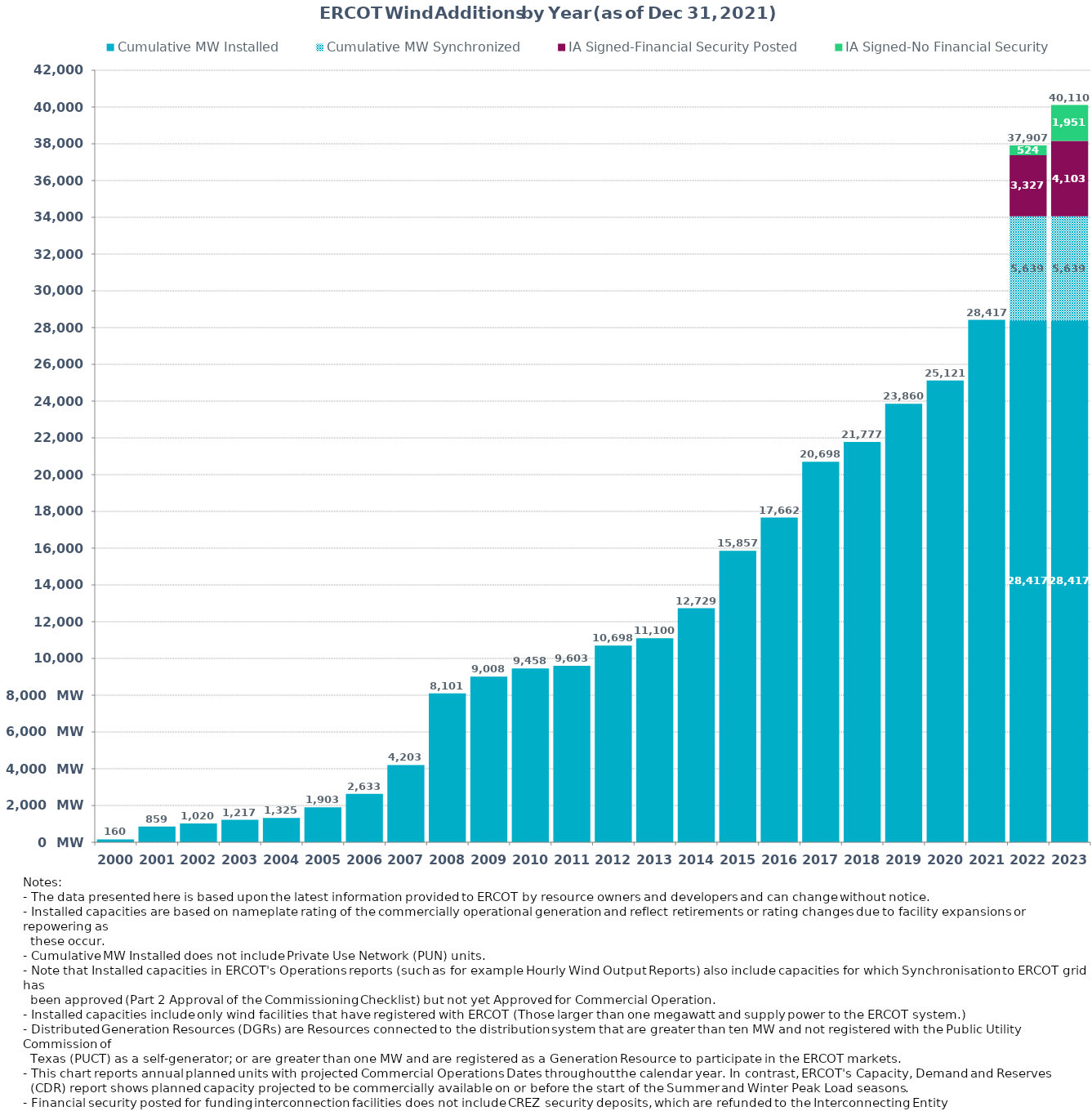
| Category | Cumulative MW Installed | Cumulative MW Synchronized | IA Signed-Financial Security Posted  | IA Signed-No Financial Security  | Other Planned | Cumulative Installed and Planned |
|---|---|---|---|---|---|---|
| 2000.0 | 160.37 | 0 | 0 | 0 | 0 | 160.37 |
| 2001.0 | 859.29 | 0 | 0 | 0 | 0 | 859.29 |
| 2002.0 | 1019.79 | 0 | 0 | 0 | 0 | 1019.79 |
| 2003.0 | 1217.29 | 0 | 0 | 0 | 0 | 1217.29 |
| 2004.0 | 1325.29 | 0 | 0 | 0 | 0 | 1325.29 |
| 2005.0 | 1902.69 | 0 | 0 | 0 | 0 | 1902.69 |
| 2006.0 | 2633.39 | 0 | 0 | 0 | 0 | 2633.39 |
| 2007.0 | 4203.41 | 0 | 0 | 0 | 0 | 4203.41 |
| 2008.0 | 8101.01 | 0 | 0 | 0 | 0 | 8101.01 |
| 2009.0 | 9007.57 | 0 | 0 | 0 | 0 | 9007.57 |
| 2010.0 | 9458.49 | 0 | 0 | 0 | 0 | 9458.49 |
| 2011.0 | 9603.49 | 0 | 0 | 0 | 0 | 9603.49 |
| 2012.0 | 10698.35 | 0 | 0 | 0 | 0 | 10698.35 |
| 2013.0 | 11100.05 | 0 | 0 | 0 | 0 | 11100.05 |
| 2014.0 | 12728.93 | 0 | 0 | 0 | 0 | 12728.93 |
| 2015.0 | 15857.48 | 0 | 0 | 0 | 0 | 15857.48 |
| 2016.0 | 17662.45 | 0 | 0 | 0 | 0 | 17662.45 |
| 2017.0 | 20697.84 | 0 | 0 | 0 | 0 | 20697.84 |
| 2018.0 | 21777 | 0 | 0 | 0 | 0 | 21777 |
| 2019.0 | 23860 | 0 | 0 | 0 | 0 | 23860 |
| 2020.0 | 25121 | 0 | 0 | 0 | 0 | 25121 |
| 2021.0 | 28416.82 | 0 | 0 | 0 | 0 | 28416.82 |
| 2022.0 | 28416.82 | 5639.04 | 3327.41 | 523.7 | 0 | 37906.97 |
| 2023.0 | 28417 | 5639.04 | 4103 | 1950.6 | 0 | 40109.64 |